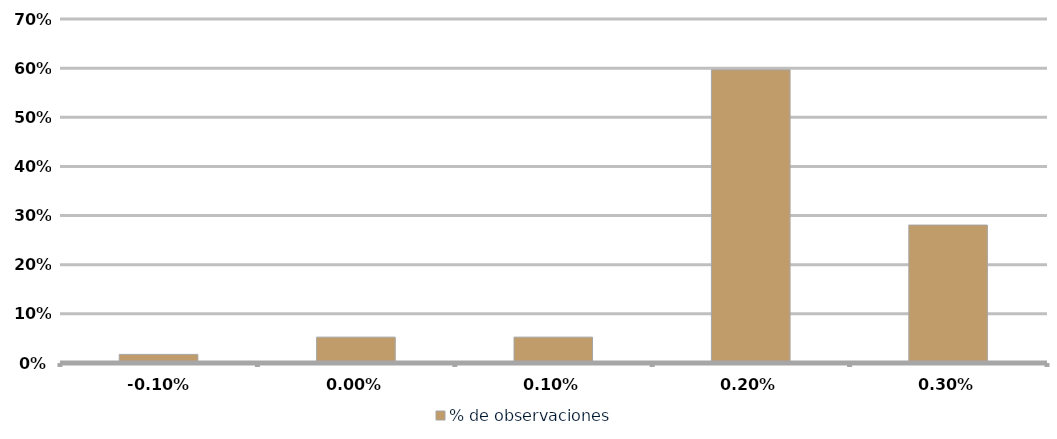
| Category | % de observaciones  |
|---|---|
| -0.001 | 0.018 |
| 0.0 | 0.053 |
| 0.001 | 0.053 |
| 0.002 | 0.596 |
| 0.003 | 0.281 |